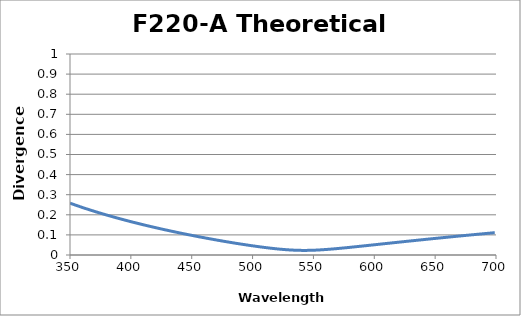
| Category | Divergence (deg) |
|---|---|
| 350.0 | 0.258 |
| 351.0 | 0.256 |
| 352.0 | 0.254 |
| 353.0 | 0.252 |
| 354.0 | 0.249 |
| 355.0 | 0.247 |
| 356.0 | 0.245 |
| 357.0 | 0.243 |
| 358.0 | 0.241 |
| 359.0 | 0.239 |
| 360.0 | 0.237 |
| 361.0 | 0.235 |
| 362.0 | 0.233 |
| 363.0 | 0.231 |
| 364.0 | 0.229 |
| 365.0 | 0.227 |
| 366.0 | 0.225 |
| 367.0 | 0.223 |
| 368.0 | 0.221 |
| 369.0 | 0.219 |
| 370.0 | 0.217 |
| 371.0 | 0.215 |
| 372.0 | 0.214 |
| 373.0 | 0.212 |
| 374.0 | 0.21 |
| 375.0 | 0.208 |
| 376.0 | 0.206 |
| 377.0 | 0.204 |
| 378.0 | 0.203 |
| 379.0 | 0.201 |
| 380.0 | 0.199 |
| 381.0 | 0.197 |
| 382.0 | 0.196 |
| 383.0 | 0.194 |
| 384.0 | 0.192 |
| 385.0 | 0.19 |
| 386.0 | 0.189 |
| 387.0 | 0.187 |
| 388.0 | 0.185 |
| 389.0 | 0.184 |
| 390.0 | 0.182 |
| 391.0 | 0.18 |
| 392.0 | 0.179 |
| 393.0 | 0.177 |
| 394.0 | 0.176 |
| 395.0 | 0.174 |
| 396.0 | 0.172 |
| 397.0 | 0.171 |
| 398.0 | 0.169 |
| 399.0 | 0.168 |
| 400.0 | 0.166 |
| 401.0 | 0.164 |
| 402.0 | 0.163 |
| 403.0 | 0.161 |
| 404.0 | 0.16 |
| 405.0 | 0.158 |
| 406.0 | 0.157 |
| 407.0 | 0.155 |
| 408.0 | 0.154 |
| 409.0 | 0.152 |
| 410.0 | 0.151 |
| 411.0 | 0.149 |
| 412.0 | 0.148 |
| 413.0 | 0.146 |
| 414.0 | 0.145 |
| 415.0 | 0.144 |
| 416.0 | 0.142 |
| 417.0 | 0.141 |
| 418.0 | 0.139 |
| 419.0 | 0.138 |
| 420.0 | 0.136 |
| 421.0 | 0.135 |
| 422.0 | 0.134 |
| 423.0 | 0.132 |
| 424.0 | 0.131 |
| 425.0 | 0.13 |
| 426.0 | 0.128 |
| 427.0 | 0.127 |
| 428.0 | 0.126 |
| 429.0 | 0.124 |
| 430.0 | 0.123 |
| 431.0 | 0.122 |
| 432.0 | 0.12 |
| 433.0 | 0.119 |
| 434.0 | 0.118 |
| 435.0 | 0.116 |
| 436.0 | 0.115 |
| 437.0 | 0.114 |
| 438.0 | 0.112 |
| 439.0 | 0.111 |
| 440.0 | 0.11 |
| 441.0 | 0.109 |
| 442.0 | 0.108 |
| 443.0 | 0.106 |
| 444.0 | 0.105 |
| 445.0 | 0.104 |
| 446.0 | 0.102 |
| 447.0 | 0.101 |
| 448.0 | 0.1 |
| 449.0 | 0.099 |
| 450.0 | 0.098 |
| 451.0 | 0.096 |
| 452.0 | 0.095 |
| 453.0 | 0.094 |
| 454.0 | 0.093 |
| 455.0 | 0.092 |
| 456.0 | 0.091 |
| 457.0 | 0.09 |
| 458.0 | 0.088 |
| 459.0 | 0.087 |
| 460.0 | 0.086 |
| 461.0 | 0.085 |
| 462.0 | 0.084 |
| 463.0 | 0.083 |
| 464.0 | 0.082 |
| 465.0 | 0.08 |
| 466.0 | 0.079 |
| 467.0 | 0.078 |
| 468.0 | 0.077 |
| 469.0 | 0.076 |
| 470.0 | 0.075 |
| 471.0 | 0.074 |
| 472.0 | 0.073 |
| 473.0 | 0.072 |
| 474.0 | 0.071 |
| 475.0 | 0.07 |
| 476.0 | 0.069 |
| 477.0 | 0.068 |
| 478.0 | 0.067 |
| 479.0 | 0.066 |
| 480.0 | 0.065 |
| 481.0 | 0.064 |
| 482.0 | 0.063 |
| 483.0 | 0.062 |
| 484.0 | 0.061 |
| 485.0 | 0.06 |
| 486.0 | 0.059 |
| 487.0 | 0.058 |
| 488.0 | 0.057 |
| 489.0 | 0.056 |
| 490.0 | 0.055 |
| 491.0 | 0.054 |
| 492.0 | 0.053 |
| 493.0 | 0.052 |
| 494.0 | 0.051 |
| 495.0 | 0.05 |
| 496.0 | 0.049 |
| 497.0 | 0.048 |
| 498.0 | 0.047 |
| 499.0 | 0.046 |
| 500.0 | 0.046 |
| 501.0 | 0.045 |
| 502.0 | 0.044 |
| 503.0 | 0.043 |
| 504.0 | 0.042 |
| 505.0 | 0.041 |
| 506.0 | 0.041 |
| 507.0 | 0.04 |
| 508.0 | 0.039 |
| 509.0 | 0.038 |
| 510.0 | 0.038 |
| 511.0 | 0.037 |
| 512.0 | 0.036 |
| 513.0 | 0.035 |
| 514.0 | 0.034 |
| 515.0 | 0.034 |
| 516.0 | 0.033 |
| 517.0 | 0.032 |
| 518.0 | 0.032 |
| 519.0 | 0.031 |
| 520.0 | 0.03 |
| 521.0 | 0.03 |
| 522.0 | 0.029 |
| 523.0 | 0.029 |
| 524.0 | 0.028 |
| 525.0 | 0.028 |
| 526.0 | 0.027 |
| 527.0 | 0.027 |
| 528.0 | 0.026 |
| 529.0 | 0.026 |
| 530.0 | 0.025 |
| 531.0 | 0.025 |
| 532.0 | 0.025 |
| 533.0 | 0.024 |
| 534.0 | 0.024 |
| 535.0 | 0.024 |
| 536.0 | 0.024 |
| 537.0 | 0.023 |
| 538.0 | 0.023 |
| 539.0 | 0.023 |
| 540.0 | 0.023 |
| 541.0 | 0.023 |
| 542.0 | 0.023 |
| 543.0 | 0.023 |
| 544.0 | 0.023 |
| 545.0 | 0.023 |
| 546.0 | 0.023 |
| 547.0 | 0.023 |
| 548.0 | 0.023 |
| 549.0 | 0.024 |
| 550.0 | 0.024 |
| 551.0 | 0.024 |
| 552.0 | 0.024 |
| 553.0 | 0.025 |
| 554.0 | 0.025 |
| 555.0 | 0.025 |
| 556.0 | 0.026 |
| 557.0 | 0.026 |
| 558.0 | 0.026 |
| 559.0 | 0.027 |
| 560.0 | 0.027 |
| 561.0 | 0.028 |
| 562.0 | 0.028 |
| 563.0 | 0.029 |
| 564.0 | 0.029 |
| 565.0 | 0.03 |
| 566.0 | 0.03 |
| 567.0 | 0.031 |
| 568.0 | 0.031 |
| 569.0 | 0.032 |
| 570.0 | 0.032 |
| 571.0 | 0.033 |
| 572.0 | 0.033 |
| 573.0 | 0.034 |
| 574.0 | 0.034 |
| 575.0 | 0.035 |
| 576.0 | 0.036 |
| 577.0 | 0.036 |
| 578.0 | 0.037 |
| 579.0 | 0.038 |
| 580.0 | 0.038 |
| 581.0 | 0.039 |
| 582.0 | 0.039 |
| 583.0 | 0.04 |
| 584.0 | 0.041 |
| 585.0 | 0.041 |
| 586.0 | 0.042 |
| 587.0 | 0.042 |
| 588.0 | 0.043 |
| 589.0 | 0.044 |
| 590.0 | 0.044 |
| 591.0 | 0.045 |
| 592.0 | 0.046 |
| 593.0 | 0.046 |
| 594.0 | 0.047 |
| 595.0 | 0.048 |
| 596.0 | 0.048 |
| 597.0 | 0.049 |
| 598.0 | 0.05 |
| 599.0 | 0.05 |
| 600.0 | 0.051 |
| 601.0 | 0.052 |
| 602.0 | 0.052 |
| 603.0 | 0.053 |
| 604.0 | 0.053 |
| 605.0 | 0.054 |
| 606.0 | 0.055 |
| 607.0 | 0.055 |
| 608.0 | 0.056 |
| 609.0 | 0.057 |
| 610.0 | 0.057 |
| 611.0 | 0.058 |
| 612.0 | 0.059 |
| 613.0 | 0.059 |
| 614.0 | 0.06 |
| 615.0 | 0.06 |
| 616.0 | 0.061 |
| 617.0 | 0.062 |
| 618.0 | 0.062 |
| 619.0 | 0.063 |
| 620.0 | 0.064 |
| 621.0 | 0.064 |
| 622.0 | 0.065 |
| 623.0 | 0.066 |
| 624.0 | 0.066 |
| 625.0 | 0.067 |
| 626.0 | 0.068 |
| 627.0 | 0.068 |
| 628.0 | 0.069 |
| 629.0 | 0.07 |
| 630.0 | 0.07 |
| 631.0 | 0.071 |
| 632.0 | 0.071 |
| 633.0 | 0.072 |
| 634.0 | 0.073 |
| 635.0 | 0.073 |
| 636.0 | 0.074 |
| 637.0 | 0.074 |
| 638.0 | 0.075 |
| 639.0 | 0.076 |
| 640.0 | 0.076 |
| 641.0 | 0.077 |
| 642.0 | 0.078 |
| 643.0 | 0.078 |
| 644.0 | 0.079 |
| 645.0 | 0.079 |
| 646.0 | 0.08 |
| 647.0 | 0.081 |
| 648.0 | 0.081 |
| 649.0 | 0.082 |
| 650.0 | 0.082 |
| 651.0 | 0.083 |
| 652.0 | 0.084 |
| 653.0 | 0.084 |
| 654.0 | 0.085 |
| 655.0 | 0.086 |
| 656.0 | 0.086 |
| 657.0 | 0.087 |
| 658.0 | 0.087 |
| 659.0 | 0.088 |
| 660.0 | 0.088 |
| 661.0 | 0.089 |
| 662.0 | 0.09 |
| 663.0 | 0.09 |
| 664.0 | 0.091 |
| 665.0 | 0.092 |
| 666.0 | 0.092 |
| 667.0 | 0.093 |
| 668.0 | 0.093 |
| 669.0 | 0.094 |
| 670.0 | 0.094 |
| 671.0 | 0.095 |
| 672.0 | 0.096 |
| 673.0 | 0.096 |
| 674.0 | 0.097 |
| 675.0 | 0.097 |
| 676.0 | 0.098 |
| 677.0 | 0.098 |
| 678.0 | 0.099 |
| 679.0 | 0.1 |
| 680.0 | 0.1 |
| 681.0 | 0.101 |
| 682.0 | 0.101 |
| 683.0 | 0.102 |
| 684.0 | 0.103 |
| 685.0 | 0.103 |
| 686.0 | 0.104 |
| 687.0 | 0.104 |
| 688.0 | 0.105 |
| 689.0 | 0.105 |
| 690.0 | 0.106 |
| 691.0 | 0.106 |
| 692.0 | 0.107 |
| 693.0 | 0.108 |
| 694.0 | 0.108 |
| 695.0 | 0.109 |
| 696.0 | 0.109 |
| 697.0 | 0.11 |
| 698.0 | 0.11 |
| 699.0 | 0.111 |